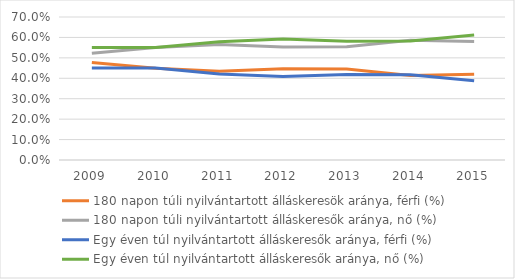
| Category | 180 napon túli nyilvántartott álláskeresök aránya, férfi (%) | 180 napon túli nyilvántartott álláskeresők aránya, nő (%) | Egy éven túl nyilvántartott álláskeresők aránya, férfi (%) | Egy éven túl nyilvántartott álláskeresők aránya, nő (%) |
|---|---|---|---|---|
| 2009.0 | 0.478 | 0.522 | 0.45 | 0.55 |
| 2010.0 | 0.449 | 0.551 | 0.45 | 0.55 |
| 2011.0 | 0.435 | 0.565 | 0.421 | 0.579 |
| 2012.0 | 0.447 | 0.553 | 0.408 | 0.592 |
| 2013.0 | 0.445 | 0.555 | 0.418 | 0.582 |
| 2014.0 | 0.414 | 0.586 | 0.417 | 0.583 |
| 2015.0 | 0.42 | 0.58 | 0.388 | 0.612 |